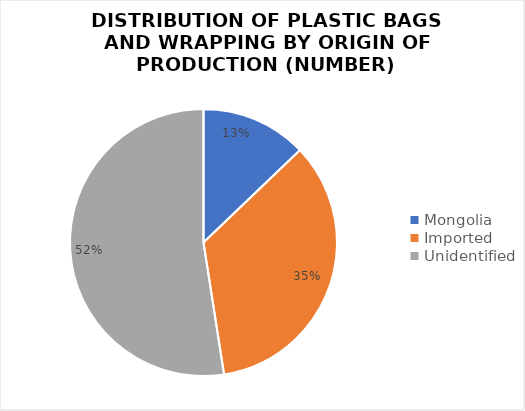
| Category | Series 0 |
|---|---|
| Mongolia | 743 |
| Imported | 2009 |
| Unidentified | 3037 |